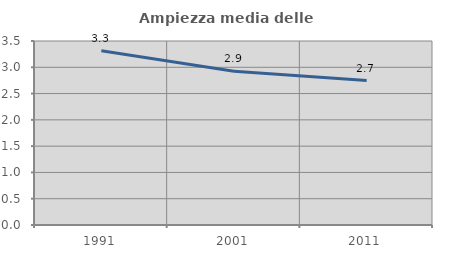
| Category | Ampiezza media delle famiglie |
|---|---|
| 1991.0 | 3.315 |
| 2001.0 | 2.923 |
| 2011.0 | 2.747 |